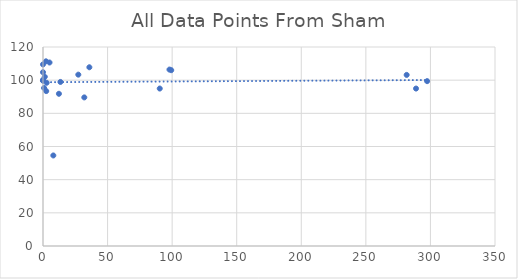
| Category | All Data Points From Sham |
|---|---|
| 281.6 | 103.172 |
| 97.93 | 106.39 |
| 35.9 | 107.776 |
| 13.5 | 98.926 |
| 5.05 | 110.648 |
| 2.29 | 111.36 |
| 0.0 | 100 |
| 0.0 | 104.793 |
| 297.435 | 99.412 |
| 99.29 | 106.021 |
| 27.345 | 103.328 |
| 7.99 | 54.594 |
| 2.82 | 98.44 |
| 1.385 | 102.029 |
| 0.0 | 100 |
| 0.0 | 109.509 |
| 288.85 | 94.941 |
| 90.4 | 94.952 |
| 31.98 | 89.606 |
| 12.33 | 91.787 |
| 2.49 | 93.414 |
| 0.82 | 95.276 |
| 0.0 | 100 |
| 0.0 | 99.681 |